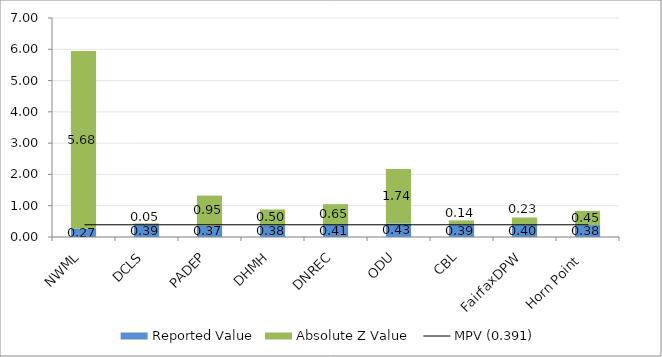
| Category | Reported Value | Absolute Z Value  |
|---|---|---|
| NWML | 0.266 | 5.682 |
| DCLS | 0.39 | 0.045 |
| PADEP | 0.37 | 0.955 |
| DHMH | 0.38 | 0.5 |
| DNREC | 0.405 | 0.645 |
| ODU | 0.429 | 1.741 |
| CBL | 0.394 | 0.136 |
| FairfaxDPW | 0.396 | 0.227 |
| Horn Point  | 0.381 | 0.455 |